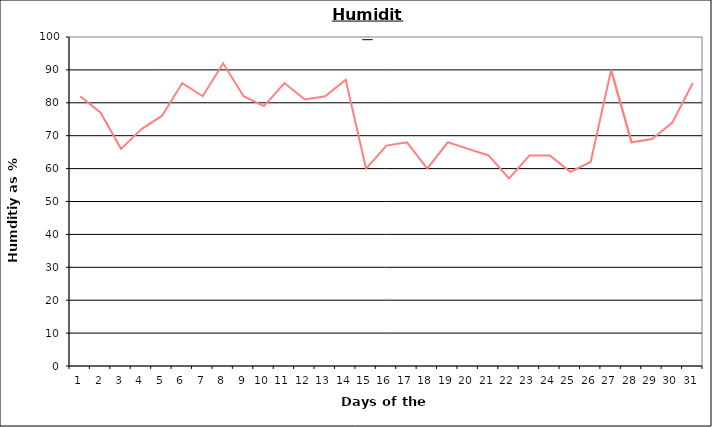
| Category | Series 0 |
|---|---|
| 0 | 82 |
| 1 | 77 |
| 2 | 66 |
| 3 | 72 |
| 4 | 76 |
| 5 | 86 |
| 6 | 82 |
| 7 | 92 |
| 8 | 82 |
| 9 | 79 |
| 10 | 86 |
| 11 | 81 |
| 12 | 82 |
| 13 | 87 |
| 14 | 60 |
| 15 | 67 |
| 16 | 68 |
| 17 | 60 |
| 18 | 68 |
| 19 | 66 |
| 20 | 64 |
| 21 | 57 |
| 22 | 64 |
| 23 | 64 |
| 24 | 59 |
| 25 | 62 |
| 26 | 90 |
| 27 | 68 |
| 28 | 69 |
| 29 | 74 |
| 30 | 86 |